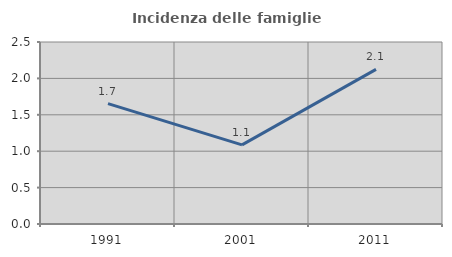
| Category | Incidenza delle famiglie numerose |
|---|---|
| 1991.0 | 1.653 |
| 2001.0 | 1.087 |
| 2011.0 | 2.124 |